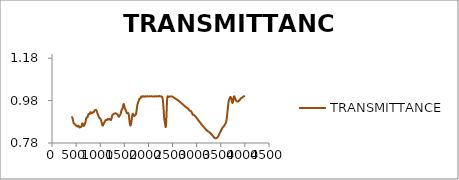
| Category | TRANSMITTANCE |
|---|---|
| 3999.640137 | 1.002 |
| 3997.71167 | 1.002 |
| 3995.783203 | 1.002 |
| 3993.854736 | 1.002 |
| 3991.92627 | 1.001 |
| 3989.997803 | 1.001 |
| 3988.069336 | 1.001 |
| 3986.140869 | 1.001 |
| 3984.212402 | 1.001 |
| 3982.283936 | 1 |
| 3980.355469 | 1 |
| 3978.427002 | 1 |
| 3976.498535 | 1 |
| 3974.570068 | 1 |
| 3972.641602 | 1 |
| 3970.713135 | 0.999 |
| 3968.784668 | 0.999 |
| 3966.856201 | 0.999 |
| 3964.927734 | 0.999 |
| 3962.999268 | 0.998 |
| 3961.070801 | 0.998 |
| 3959.142334 | 0.998 |
| 3957.213867 | 0.997 |
| 3955.2854 | 0.997 |
| 3953.356934 | 0.996 |
| 3951.428467 | 0.996 |
| 3949.5 | 0.996 |
| 3947.571533 | 0.995 |
| 3945.643066 | 0.995 |
| 3943.7146 | 0.994 |
| 3941.786133 | 0.994 |
| 3939.857666 | 0.994 |
| 3937.929199 | 0.993 |
| 3936.000732 | 0.993 |
| 3934.072266 | 0.993 |
| 3932.143799 | 0.993 |
| 3930.215332 | 0.993 |
| 3928.286865 | 0.992 |
| 3926.358398 | 0.992 |
| 3924.429932 | 0.992 |
| 3922.501465 | 0.992 |
| 3920.572998 | 0.992 |
| 3918.644531 | 0.991 |
| 3916.716064 | 0.991 |
| 3914.787598 | 0.99 |
| 3912.859131 | 0.989 |
| 3910.930664 | 0.989 |
| 3909.002197 | 0.988 |
| 3907.07373 | 0.987 |
| 3905.145264 | 0.986 |
| 3903.216797 | 0.986 |
| 3901.28833 | 0.985 |
| 3899.359863 | 0.985 |
| 3897.431396 | 0.984 |
| 3895.50293 | 0.984 |
| 3893.574463 | 0.983 |
| 3891.645996 | 0.983 |
| 3889.717529 | 0.983 |
| 3887.789063 | 0.983 |
| 3885.860596 | 0.982 |
| 3883.932129 | 0.982 |
| 3882.003662 | 0.982 |
| 3880.075195 | 0.981 |
| 3878.146729 | 0.98 |
| 3876.218262 | 0.98 |
| 3874.289795 | 0.979 |
| 3872.361328 | 0.979 |
| 3870.432861 | 0.978 |
| 3868.504395 | 0.977 |
| 3866.575928 | 0.977 |
| 3864.647461 | 0.977 |
| 3862.718994 | 0.976 |
| 3860.790527 | 0.976 |
| 3858.862061 | 0.976 |
| 3856.933594 | 0.976 |
| 3855.005127 | 0.976 |
| 3853.07666 | 0.976 |
| 3851.148193 | 0.976 |
| 3849.219727 | 0.976 |
| 3847.29126 | 0.976 |
| 3845.362793 | 0.976 |
| 3843.434326 | 0.976 |
| 3841.505859 | 0.976 |
| 3839.577393 | 0.976 |
| 3837.648926 | 0.976 |
| 3835.720459 | 0.976 |
| 3833.791992 | 0.977 |
| 3831.863525 | 0.977 |
| 3829.935059 | 0.977 |
| 3828.006592 | 0.977 |
| 3826.078125 | 0.978 |
| 3824.149658 | 0.979 |
| 3822.221191 | 0.979 |
| 3820.292725 | 0.98 |
| 3818.364258 | 0.98 |
| 3816.435791 | 0.981 |
| 3814.507324 | 0.981 |
| 3812.578857 | 0.982 |
| 3810.650391 | 0.982 |
| 3808.721924 | 0.983 |
| 3806.793457 | 0.984 |
| 3804.86499 | 0.985 |
| 3802.936523 | 0.986 |
| 3801.008057 | 0.987 |
| 3799.07959 | 0.989 |
| 3797.151123 | 0.99 |
| 3795.222656 | 0.991 |
| 3793.294189 | 0.993 |
| 3791.365723 | 0.994 |
| 3789.437256 | 0.996 |
| 3787.508789 | 0.997 |
| 3785.580322 | 0.998 |
| 3783.651855 | 0.999 |
| 3781.723389 | 1 |
| 3779.794922 | 1 |
| 3777.866455 | 1 |
| 3775.937988 | 1 |
| 3774.009521 | 0.999 |
| 3772.081055 | 0.998 |
| 3770.152588 | 0.997 |
| 3768.224121 | 0.996 |
| 3766.295654 | 0.994 |
| 3764.367188 | 0.991 |
| 3762.438721 | 0.989 |
| 3760.510254 | 0.986 |
| 3758.581787 | 0.983 |
| 3756.65332 | 0.981 |
| 3754.724854 | 0.978 |
| 3752.796387 | 0.976 |
| 3750.86792 | 0.974 |
| 3748.939453 | 0.972 |
| 3747.010986 | 0.97 |
| 3745.08252 | 0.969 |
| 3743.154053 | 0.969 |
| 3741.225586 | 0.969 |
| 3739.297119 | 0.969 |
| 3737.368652 | 0.97 |
| 3735.440186 | 0.972 |
| 3733.511719 | 0.973 |
| 3731.583252 | 0.975 |
| 3729.654785 | 0.977 |
| 3727.726318 | 0.979 |
| 3725.797852 | 0.982 |
| 3723.869385 | 0.984 |
| 3721.940918 | 0.986 |
| 3720.012451 | 0.988 |
| 3718.083984 | 0.989 |
| 3716.155518 | 0.991 |
| 3714.227051 | 0.992 |
| 3712.298584 | 0.994 |
| 3710.370117 | 0.995 |
| 3708.44165 | 0.996 |
| 3706.513184 | 0.997 |
| 3704.584717 | 0.997 |
| 3702.65625 | 0.997 |
| 3700.727783 | 0.998 |
| 3698.799316 | 0.997 |
| 3696.87085 | 0.997 |
| 3694.942383 | 0.997 |
| 3693.013916 | 0.996 |
| 3691.085449 | 0.995 |
| 3689.156982 | 0.994 |
| 3687.228516 | 0.993 |
| 3685.300049 | 0.991 |
| 3683.371582 | 0.99 |
| 3681.443115 | 0.989 |
| 3679.514648 | 0.988 |
| 3677.586182 | 0.987 |
| 3675.657715 | 0.986 |
| 3673.729248 | 0.985 |
| 3671.800781 | 0.984 |
| 3669.872314 | 0.982 |
| 3667.943848 | 0.981 |
| 3666.015381 | 0.979 |
| 3664.086914 | 0.977 |
| 3662.158447 | 0.975 |
| 3660.22998 | 0.972 |
| 3658.301514 | 0.969 |
| 3656.373047 | 0.966 |
| 3654.44458 | 0.962 |
| 3652.516113 | 0.958 |
| 3650.587646 | 0.954 |
| 3648.65918 | 0.95 |
| 3646.730713 | 0.946 |
| 3644.802246 | 0.941 |
| 3642.873779 | 0.937 |
| 3640.945313 | 0.933 |
| 3639.016846 | 0.929 |
| 3637.088379 | 0.925 |
| 3635.159912 | 0.92 |
| 3633.231445 | 0.916 |
| 3631.302979 | 0.912 |
| 3629.374512 | 0.908 |
| 3627.446045 | 0.904 |
| 3625.517578 | 0.901 |
| 3623.589111 | 0.897 |
| 3621.660645 | 0.894 |
| 3619.732178 | 0.89 |
| 3617.803711 | 0.888 |
| 3615.875244 | 0.885 |
| 3613.946777 | 0.883 |
| 3612.018311 | 0.881 |
| 3610.089844 | 0.879 |
| 3608.161377 | 0.878 |
| 3606.23291 | 0.876 |
| 3604.304443 | 0.875 |
| 3602.375977 | 0.874 |
| 3600.44751 | 0.873 |
| 3598.519043 | 0.872 |
| 3596.590576 | 0.872 |
| 3594.662109 | 0.871 |
| 3592.733643 | 0.87 |
| 3590.805176 | 0.869 |
| 3588.876709 | 0.869 |
| 3586.948242 | 0.868 |
| 3585.019775 | 0.867 |
| 3583.091309 | 0.867 |
| 3581.162842 | 0.866 |
| 3579.234375 | 0.865 |
| 3577.305908 | 0.864 |
| 3575.377441 | 0.864 |
| 3573.448975 | 0.863 |
| 3571.520508 | 0.862 |
| 3569.592041 | 0.861 |
| 3567.663574 | 0.86 |
| 3565.735107 | 0.86 |
| 3563.806641 | 0.859 |
| 3561.878174 | 0.858 |
| 3559.949707 | 0.858 |
| 3558.02124 | 0.857 |
| 3556.092773 | 0.857 |
| 3554.164307 | 0.857 |
| 3552.23584 | 0.856 |
| 3550.307373 | 0.856 |
| 3548.378906 | 0.856 |
| 3546.450439 | 0.855 |
| 3544.521973 | 0.855 |
| 3542.593506 | 0.854 |
| 3540.665039 | 0.854 |
| 3538.736572 | 0.853 |
| 3536.808105 | 0.853 |
| 3534.879639 | 0.852 |
| 3532.951172 | 0.851 |
| 3531.022705 | 0.85 |
| 3529.094238 | 0.85 |
| 3527.165771 | 0.849 |
| 3525.237305 | 0.848 |
| 3523.308838 | 0.847 |
| 3521.380371 | 0.846 |
| 3519.451904 | 0.845 |
| 3517.523438 | 0.845 |
| 3515.594971 | 0.844 |
| 3513.666504 | 0.843 |
| 3511.738037 | 0.842 |
| 3509.80957 | 0.841 |
| 3507.881104 | 0.84 |
| 3505.952637 | 0.839 |
| 3504.02417 | 0.839 |
| 3502.095703 | 0.838 |
| 3500.167236 | 0.837 |
| 3498.23877 | 0.836 |
| 3496.310303 | 0.835 |
| 3494.381836 | 0.834 |
| 3492.453369 | 0.833 |
| 3490.524902 | 0.832 |
| 3488.596436 | 0.832 |
| 3486.667969 | 0.831 |
| 3484.739502 | 0.83 |
| 3482.811035 | 0.829 |
| 3480.882568 | 0.828 |
| 3478.954102 | 0.827 |
| 3477.025635 | 0.826 |
| 3475.097168 | 0.826 |
| 3473.168701 | 0.825 |
| 3471.240234 | 0.824 |
| 3469.311768 | 0.823 |
| 3467.383301 | 0.822 |
| 3465.454834 | 0.821 |
| 3463.526367 | 0.82 |
| 3461.5979 | 0.819 |
| 3459.669434 | 0.818 |
| 3457.740967 | 0.817 |
| 3455.8125 | 0.816 |
| 3453.884033 | 0.815 |
| 3451.955566 | 0.814 |
| 3450.0271 | 0.813 |
| 3448.098633 | 0.812 |
| 3446.170166 | 0.812 |
| 3444.241699 | 0.811 |
| 3442.313232 | 0.81 |
| 3440.384766 | 0.81 |
| 3438.456299 | 0.809 |
| 3436.527832 | 0.809 |
| 3434.599365 | 0.808 |
| 3432.670898 | 0.808 |
| 3430.742432 | 0.807 |
| 3428.813965 | 0.807 |
| 3426.885498 | 0.806 |
| 3424.957031 | 0.806 |
| 3423.028564 | 0.805 |
| 3421.100098 | 0.805 |
| 3419.171631 | 0.804 |
| 3417.243164 | 0.804 |
| 3415.314697 | 0.804 |
| 3413.38623 | 0.803 |
| 3411.457764 | 0.803 |
| 3409.529297 | 0.803 |
| 3407.60083 | 0.803 |
| 3405.672363 | 0.803 |
| 3403.743896 | 0.803 |
| 3401.81543 | 0.802 |
| 3399.886963 | 0.802 |
| 3397.958496 | 0.802 |
| 3396.030029 | 0.802 |
| 3394.101563 | 0.802 |
| 3392.173096 | 0.802 |
| 3390.244629 | 0.802 |
| 3388.316162 | 0.802 |
| 3386.387695 | 0.803 |
| 3384.459229 | 0.803 |
| 3382.530762 | 0.803 |
| 3380.602295 | 0.803 |
| 3378.673828 | 0.803 |
| 3376.745361 | 0.803 |
| 3374.816895 | 0.804 |
| 3372.888428 | 0.804 |
| 3370.959961 | 0.804 |
| 3369.031494 | 0.804 |
| 3367.103027 | 0.805 |
| 3365.174561 | 0.805 |
| 3363.246094 | 0.806 |
| 3361.317627 | 0.806 |
| 3359.38916 | 0.807 |
| 3357.460693 | 0.807 |
| 3355.532227 | 0.808 |
| 3353.60376 | 0.808 |
| 3351.675293 | 0.809 |
| 3349.746826 | 0.809 |
| 3347.818359 | 0.81 |
| 3345.889893 | 0.81 |
| 3343.961426 | 0.811 |
| 3342.032959 | 0.811 |
| 3340.104492 | 0.812 |
| 3338.176025 | 0.812 |
| 3336.247559 | 0.813 |
| 3334.319092 | 0.813 |
| 3332.390625 | 0.814 |
| 3330.462158 | 0.815 |
| 3328.533691 | 0.815 |
| 3326.605225 | 0.816 |
| 3324.676758 | 0.816 |
| 3322.748291 | 0.817 |
| 3320.819824 | 0.818 |
| 3318.891357 | 0.818 |
| 3316.962891 | 0.819 |
| 3315.034424 | 0.819 |
| 3313.105957 | 0.82 |
| 3311.17749 | 0.82 |
| 3309.249023 | 0.821 |
| 3307.320557 | 0.822 |
| 3305.39209 | 0.822 |
| 3303.463623 | 0.823 |
| 3301.535156 | 0.823 |
| 3299.606689 | 0.824 |
| 3297.678223 | 0.824 |
| 3295.749756 | 0.825 |
| 3293.821289 | 0.825 |
| 3291.892822 | 0.825 |
| 3289.964355 | 0.826 |
| 3288.035889 | 0.826 |
| 3286.107422 | 0.827 |
| 3284.178955 | 0.827 |
| 3282.250488 | 0.828 |
| 3280.322021 | 0.828 |
| 3278.393555 | 0.828 |
| 3276.465088 | 0.829 |
| 3274.536621 | 0.829 |
| 3272.608154 | 0.829 |
| 3270.679688 | 0.83 |
| 3268.751221 | 0.83 |
| 3266.822754 | 0.831 |
| 3264.894287 | 0.831 |
| 3262.96582 | 0.831 |
| 3261.037354 | 0.831 |
| 3259.108887 | 0.832 |
| 3257.18042 | 0.832 |
| 3255.251953 | 0.832 |
| 3253.323486 | 0.833 |
| 3251.39502 | 0.833 |
| 3249.466553 | 0.833 |
| 3247.538086 | 0.833 |
| 3245.609619 | 0.834 |
| 3243.681152 | 0.834 |
| 3241.752686 | 0.834 |
| 3239.824219 | 0.835 |
| 3237.895752 | 0.835 |
| 3235.967285 | 0.835 |
| 3234.038818 | 0.836 |
| 3232.110352 | 0.836 |
| 3230.181885 | 0.836 |
| 3228.253418 | 0.836 |
| 3226.324951 | 0.837 |
| 3224.396484 | 0.837 |
| 3222.468018 | 0.837 |
| 3220.539551 | 0.837 |
| 3218.611084 | 0.838 |
| 3216.682617 | 0.838 |
| 3214.75415 | 0.838 |
| 3212.825684 | 0.839 |
| 3210.897217 | 0.839 |
| 3208.96875 | 0.84 |
| 3207.040283 | 0.84 |
| 3205.111816 | 0.84 |
| 3203.18335 | 0.841 |
| 3201.254883 | 0.841 |
| 3199.326416 | 0.842 |
| 3197.397949 | 0.842 |
| 3195.469482 | 0.843 |
| 3193.541016 | 0.843 |
| 3191.612549 | 0.844 |
| 3189.684082 | 0.844 |
| 3187.755615 | 0.845 |
| 3185.827148 | 0.845 |
| 3183.898682 | 0.846 |
| 3181.970215 | 0.846 |
| 3180.041748 | 0.847 |
| 3178.113281 | 0.847 |
| 3176.184814 | 0.848 |
| 3174.256348 | 0.848 |
| 3172.327881 | 0.849 |
| 3170.399414 | 0.849 |
| 3168.470947 | 0.85 |
| 3166.54248 | 0.85 |
| 3164.614014 | 0.851 |
| 3162.685547 | 0.851 |
| 3160.75708 | 0.852 |
| 3158.828613 | 0.853 |
| 3156.900146 | 0.853 |
| 3154.97168 | 0.854 |
| 3153.043213 | 0.854 |
| 3151.114746 | 0.855 |
| 3149.186279 | 0.855 |
| 3147.257813 | 0.856 |
| 3145.329346 | 0.856 |
| 3143.400879 | 0.857 |
| 3141.472412 | 0.857 |
| 3139.543945 | 0.857 |
| 3137.615479 | 0.858 |
| 3135.687012 | 0.858 |
| 3133.758545 | 0.859 |
| 3131.830078 | 0.859 |
| 3129.901611 | 0.86 |
| 3127.973145 | 0.86 |
| 3126.044678 | 0.86 |
| 3124.116211 | 0.861 |
| 3122.187744 | 0.861 |
| 3120.259277 | 0.862 |
| 3118.330811 | 0.863 |
| 3116.402344 | 0.863 |
| 3114.473877 | 0.864 |
| 3112.54541 | 0.864 |
| 3110.616943 | 0.865 |
| 3108.688477 | 0.865 |
| 3106.76001 | 0.866 |
| 3104.831543 | 0.866 |
| 3102.903076 | 0.867 |
| 3100.974609 | 0.868 |
| 3099.046143 | 0.868 |
| 3097.117676 | 0.869 |
| 3095.189209 | 0.869 |
| 3093.260742 | 0.87 |
| 3091.332275 | 0.87 |
| 3089.403809 | 0.871 |
| 3087.475342 | 0.871 |
| 3085.546875 | 0.872 |
| 3083.618408 | 0.873 |
| 3081.689941 | 0.873 |
| 3079.761475 | 0.874 |
| 3077.833008 | 0.874 |
| 3075.904541 | 0.875 |
| 3073.976074 | 0.876 |
| 3072.047607 | 0.876 |
| 3070.119141 | 0.877 |
| 3068.190674 | 0.877 |
| 3066.262207 | 0.878 |
| 3064.33374 | 0.878 |
| 3062.405273 | 0.879 |
| 3060.476807 | 0.88 |
| 3058.54834 | 0.88 |
| 3056.619873 | 0.881 |
| 3054.691406 | 0.881 |
| 3052.762939 | 0.882 |
| 3050.834473 | 0.882 |
| 3048.906006 | 0.883 |
| 3046.977539 | 0.884 |
| 3045.049072 | 0.884 |
| 3043.120605 | 0.885 |
| 3041.192139 | 0.885 |
| 3039.263672 | 0.886 |
| 3037.335205 | 0.886 |
| 3035.406738 | 0.887 |
| 3033.478271 | 0.888 |
| 3031.549805 | 0.888 |
| 3029.621338 | 0.889 |
| 3027.692871 | 0.889 |
| 3025.764404 | 0.89 |
| 3023.835938 | 0.891 |
| 3021.907471 | 0.891 |
| 3019.979004 | 0.892 |
| 3018.050537 | 0.893 |
| 3016.12207 | 0.893 |
| 3014.193604 | 0.894 |
| 3012.265137 | 0.894 |
| 3010.33667 | 0.895 |
| 3008.408203 | 0.895 |
| 3006.479736 | 0.896 |
| 3004.55127 | 0.897 |
| 3002.622803 | 0.897 |
| 3000.694336 | 0.898 |
| 2998.765869 | 0.898 |
| 2996.837402 | 0.899 |
| 2994.908936 | 0.9 |
| 2992.980469 | 0.9 |
| 2991.052002 | 0.901 |
| 2989.123535 | 0.901 |
| 2987.195068 | 0.902 |
| 2985.266602 | 0.903 |
| 2983.338135 | 0.903 |
| 2981.409668 | 0.904 |
| 2979.481201 | 0.904 |
| 2977.552734 | 0.905 |
| 2975.624268 | 0.905 |
| 2973.695801 | 0.906 |
| 2971.767334 | 0.906 |
| 2969.838867 | 0.907 |
| 2967.9104 | 0.907 |
| 2965.981934 | 0.907 |
| 2964.053467 | 0.908 |
| 2962.125 | 0.908 |
| 2960.196533 | 0.909 |
| 2958.268066 | 0.909 |
| 2956.3396 | 0.91 |
| 2954.411133 | 0.91 |
| 2952.482666 | 0.911 |
| 2950.554199 | 0.911 |
| 2948.625732 | 0.912 |
| 2946.697266 | 0.912 |
| 2944.768799 | 0.912 |
| 2942.840332 | 0.913 |
| 2940.911865 | 0.913 |
| 2938.983398 | 0.913 |
| 2937.054932 | 0.913 |
| 2935.126465 | 0.913 |
| 2933.197998 | 0.913 |
| 2931.269531 | 0.913 |
| 2929.341064 | 0.913 |
| 2927.412598 | 0.913 |
| 2925.484131 | 0.913 |
| 2923.555664 | 0.913 |
| 2921.627197 | 0.913 |
| 2919.69873 | 0.913 |
| 2917.770264 | 0.914 |
| 2915.841797 | 0.915 |
| 2913.91333 | 0.915 |
| 2911.984863 | 0.916 |
| 2910.056396 | 0.917 |
| 2908.12793 | 0.918 |
| 2906.199463 | 0.92 |
| 2904.270996 | 0.921 |
| 2902.342529 | 0.922 |
| 2900.414063 | 0.923 |
| 2898.485596 | 0.924 |
| 2896.557129 | 0.925 |
| 2894.628662 | 0.926 |
| 2892.700195 | 0.927 |
| 2890.771729 | 0.927 |
| 2888.843262 | 0.928 |
| 2886.914795 | 0.929 |
| 2884.986328 | 0.929 |
| 2883.057861 | 0.93 |
| 2881.129395 | 0.93 |
| 2879.200928 | 0.931 |
| 2877.272461 | 0.931 |
| 2875.343994 | 0.931 |
| 2873.415527 | 0.931 |
| 2871.487061 | 0.932 |
| 2869.558594 | 0.932 |
| 2867.630127 | 0.932 |
| 2865.70166 | 0.932 |
| 2863.773193 | 0.932 |
| 2861.844727 | 0.932 |
| 2859.91626 | 0.932 |
| 2857.987793 | 0.933 |
| 2856.059326 | 0.933 |
| 2854.130859 | 0.933 |
| 2852.202393 | 0.933 |
| 2850.273926 | 0.934 |
| 2848.345459 | 0.934 |
| 2846.416992 | 0.935 |
| 2844.488525 | 0.935 |
| 2842.560059 | 0.936 |
| 2840.631592 | 0.937 |
| 2838.703125 | 0.937 |
| 2836.774658 | 0.938 |
| 2834.846191 | 0.939 |
| 2832.917725 | 0.939 |
| 2830.989258 | 0.94 |
| 2829.060791 | 0.94 |
| 2827.132324 | 0.941 |
| 2825.203857 | 0.941 |
| 2823.275391 | 0.942 |
| 2821.346924 | 0.942 |
| 2819.418457 | 0.943 |
| 2817.48999 | 0.943 |
| 2815.561523 | 0.943 |
| 2813.633057 | 0.944 |
| 2811.70459 | 0.944 |
| 2809.776123 | 0.944 |
| 2807.847656 | 0.945 |
| 2805.919189 | 0.945 |
| 2803.990723 | 0.945 |
| 2802.062256 | 0.945 |
| 2800.133789 | 0.946 |
| 2798.205322 | 0.946 |
| 2796.276855 | 0.946 |
| 2794.348389 | 0.946 |
| 2792.419922 | 0.947 |
| 2790.491455 | 0.947 |
| 2788.562988 | 0.947 |
| 2786.634521 | 0.947 |
| 2784.706055 | 0.948 |
| 2782.777588 | 0.948 |
| 2780.849121 | 0.948 |
| 2778.920654 | 0.949 |
| 2776.992188 | 0.949 |
| 2775.063721 | 0.949 |
| 2773.135254 | 0.95 |
| 2771.206787 | 0.95 |
| 2769.27832 | 0.951 |
| 2767.349854 | 0.951 |
| 2765.421387 | 0.951 |
| 2763.49292 | 0.952 |
| 2761.564453 | 0.952 |
| 2759.635986 | 0.952 |
| 2757.70752 | 0.953 |
| 2755.779053 | 0.953 |
| 2753.850586 | 0.953 |
| 2751.922119 | 0.954 |
| 2749.993652 | 0.954 |
| 2748.065186 | 0.954 |
| 2746.136719 | 0.955 |
| 2744.208252 | 0.955 |
| 2742.279785 | 0.956 |
| 2740.351318 | 0.956 |
| 2738.422852 | 0.956 |
| 2736.494385 | 0.957 |
| 2734.565918 | 0.957 |
| 2732.637451 | 0.958 |
| 2730.708984 | 0.958 |
| 2728.780518 | 0.959 |
| 2726.852051 | 0.959 |
| 2724.923584 | 0.959 |
| 2722.995117 | 0.96 |
| 2721.06665 | 0.96 |
| 2719.138184 | 0.961 |
| 2717.209717 | 0.961 |
| 2715.28125 | 0.962 |
| 2713.352783 | 0.962 |
| 2711.424316 | 0.962 |
| 2709.49585 | 0.963 |
| 2707.567383 | 0.963 |
| 2705.638916 | 0.964 |
| 2703.710449 | 0.964 |
| 2701.781982 | 0.964 |
| 2699.853516 | 0.965 |
| 2697.925049 | 0.965 |
| 2695.996582 | 0.966 |
| 2694.068115 | 0.966 |
| 2692.139648 | 0.966 |
| 2690.211182 | 0.967 |
| 2688.282715 | 0.967 |
| 2686.354248 | 0.968 |
| 2684.425781 | 0.968 |
| 2682.497314 | 0.969 |
| 2680.568848 | 0.969 |
| 2678.640381 | 0.969 |
| 2676.711914 | 0.97 |
| 2674.783447 | 0.97 |
| 2672.85498 | 0.971 |
| 2670.926514 | 0.971 |
| 2668.998047 | 0.971 |
| 2667.06958 | 0.972 |
| 2665.141113 | 0.972 |
| 2663.212646 | 0.972 |
| 2661.28418 | 0.973 |
| 2659.355713 | 0.973 |
| 2657.427246 | 0.973 |
| 2655.498779 | 0.974 |
| 2653.570313 | 0.974 |
| 2651.641846 | 0.974 |
| 2649.713379 | 0.975 |
| 2647.784912 | 0.975 |
| 2645.856445 | 0.975 |
| 2643.927979 | 0.976 |
| 2641.999512 | 0.976 |
| 2640.071045 | 0.976 |
| 2638.142578 | 0.977 |
| 2636.214111 | 0.977 |
| 2634.285645 | 0.978 |
| 2632.357178 | 0.978 |
| 2630.428711 | 0.978 |
| 2628.500244 | 0.979 |
| 2626.571777 | 0.979 |
| 2624.643311 | 0.979 |
| 2622.714844 | 0.98 |
| 2620.786377 | 0.98 |
| 2618.85791 | 0.98 |
| 2616.929443 | 0.981 |
| 2615.000977 | 0.981 |
| 2613.07251 | 0.981 |
| 2611.144043 | 0.981 |
| 2609.215576 | 0.982 |
| 2607.287109 | 0.982 |
| 2605.358643 | 0.982 |
| 2603.430176 | 0.983 |
| 2601.501709 | 0.983 |
| 2599.573242 | 0.983 |
| 2597.644775 | 0.984 |
| 2595.716309 | 0.984 |
| 2593.787842 | 0.984 |
| 2591.859375 | 0.985 |
| 2589.930908 | 0.985 |
| 2588.002441 | 0.985 |
| 2586.073975 | 0.986 |
| 2584.145508 | 0.986 |
| 2582.217041 | 0.986 |
| 2580.288574 | 0.987 |
| 2578.360107 | 0.987 |
| 2576.431641 | 0.987 |
| 2574.503174 | 0.988 |
| 2572.574707 | 0.988 |
| 2570.64624 | 0.988 |
| 2568.717773 | 0.988 |
| 2566.789307 | 0.989 |
| 2564.86084 | 0.989 |
| 2562.932373 | 0.989 |
| 2561.003906 | 0.989 |
| 2559.075439 | 0.99 |
| 2557.146973 | 0.99 |
| 2555.218506 | 0.99 |
| 2553.290039 | 0.991 |
| 2551.361572 | 0.991 |
| 2549.433105 | 0.991 |
| 2547.504639 | 0.992 |
| 2545.576172 | 0.992 |
| 2543.647705 | 0.992 |
| 2541.719238 | 0.992 |
| 2539.790771 | 0.993 |
| 2537.862305 | 0.993 |
| 2535.933838 | 0.993 |
| 2534.005371 | 0.994 |
| 2532.076904 | 0.994 |
| 2530.148438 | 0.994 |
| 2528.219971 | 0.994 |
| 2526.291504 | 0.995 |
| 2524.363037 | 0.995 |
| 2522.43457 | 0.995 |
| 2520.506104 | 0.995 |
| 2518.577637 | 0.996 |
| 2516.64917 | 0.996 |
| 2514.720703 | 0.996 |
| 2512.792236 | 0.997 |
| 2510.86377 | 0.997 |
| 2508.935303 | 0.997 |
| 2507.006836 | 0.997 |
| 2505.078369 | 0.998 |
| 2503.149902 | 0.998 |
| 2501.221436 | 0.998 |
| 2499.292969 | 0.999 |
| 2497.364502 | 0.999 |
| 2495.436035 | 0.999 |
| 2493.507568 | 1 |
| 2491.579102 | 1 |
| 2489.650635 | 1 |
| 2487.722168 | 1 |
| 2485.793701 | 1 |
| 2483.865234 | 1 |
| 2481.936768 | 1 |
| 2480.008301 | 1 |
| 2478.079834 | 1 |
| 2476.151367 | 1 |
| 2474.2229 | 1 |
| 2472.294434 | 1 |
| 2470.365967 | 1 |
| 2468.4375 | 1 |
| 2466.509033 | 1 |
| 2464.580566 | 1 |
| 2462.6521 | 1 |
| 2460.723633 | 1 |
| 2458.795166 | 1 |
| 2456.866699 | 1 |
| 2454.938232 | 1 |
| 2453.009766 | 1 |
| 2451.081299 | 1 |
| 2449.152832 | 1 |
| 2447.224365 | 1 |
| 2445.295898 | 1 |
| 2443.367432 | 1 |
| 2441.438965 | 1 |
| 2439.510498 | 1 |
| 2437.582031 | 1 |
| 2435.653564 | 1 |
| 2433.725098 | 1 |
| 2431.796631 | 0.999 |
| 2429.868164 | 0.999 |
| 2427.939697 | 0.999 |
| 2426.01123 | 0.998 |
| 2424.082764 | 0.998 |
| 2422.154297 | 0.998 |
| 2420.22583 | 0.998 |
| 2418.297363 | 0.997 |
| 2416.368896 | 0.997 |
| 2414.44043 | 0.997 |
| 2412.511963 | 0.998 |
| 2410.583496 | 0.998 |
| 2408.655029 | 0.998 |
| 2406.726563 | 0.999 |
| 2404.798096 | 0.999 |
| 2402.869629 | 1 |
| 2400.941162 | 1 |
| 2399.012695 | 1 |
| 2397.084229 | 1 |
| 2395.155762 | 0.999 |
| 2393.227295 | 0.997 |
| 2391.298828 | 0.994 |
| 2389.370361 | 0.99 |
| 2387.441895 | 0.984 |
| 2385.513428 | 0.977 |
| 2383.584961 | 0.968 |
| 2381.656494 | 0.958 |
| 2379.728027 | 0.947 |
| 2377.799561 | 0.935 |
| 2375.871094 | 0.923 |
| 2373.942627 | 0.911 |
| 2372.01416 | 0.899 |
| 2370.085693 | 0.888 |
| 2368.157227 | 0.878 |
| 2366.22876 | 0.87 |
| 2364.300293 | 0.864 |
| 2362.371826 | 0.859 |
| 2360.443359 | 0.856 |
| 2358.514893 | 0.855 |
| 2356.586426 | 0.855 |
| 2354.657959 | 0.857 |
| 2352.729492 | 0.859 |
| 2350.801025 | 0.862 |
| 2348.872559 | 0.865 |
| 2346.944092 | 0.868 |
| 2345.015625 | 0.871 |
| 2343.087158 | 0.874 |
| 2341.158691 | 0.877 |
| 2339.230225 | 0.879 |
| 2337.301758 | 0.881 |
| 2335.373291 | 0.883 |
| 2333.444824 | 0.886 |
| 2331.516357 | 0.888 |
| 2329.587891 | 0.892 |
| 2327.659424 | 0.896 |
| 2325.730957 | 0.9 |
| 2323.80249 | 0.906 |
| 2321.874023 | 0.911 |
| 2319.945557 | 0.918 |
| 2318.01709 | 0.924 |
| 2316.088623 | 0.931 |
| 2314.160156 | 0.938 |
| 2312.231689 | 0.945 |
| 2310.303223 | 0.951 |
| 2308.374756 | 0.958 |
| 2306.446289 | 0.963 |
| 2304.517822 | 0.969 |
| 2302.589355 | 0.974 |
| 2300.660889 | 0.978 |
| 2298.732422 | 0.982 |
| 2296.803955 | 0.985 |
| 2294.875488 | 0.988 |
| 2292.947021 | 0.991 |
| 2291.018555 | 0.993 |
| 2289.090088 | 0.994 |
| 2287.161621 | 0.996 |
| 2285.233154 | 0.997 |
| 2283.304688 | 0.998 |
| 2281.376221 | 0.998 |
| 2279.447754 | 0.999 |
| 2277.519287 | 0.999 |
| 2275.59082 | 1 |
| 2273.662354 | 1 |
| 2271.733887 | 1 |
| 2269.80542 | 1 |
| 2267.876953 | 1 |
| 2265.948486 | 1 |
| 2264.02002 | 1 |
| 2262.091553 | 1 |
| 2260.163086 | 1 |
| 2258.234619 | 1 |
| 2256.306152 | 1 |
| 2254.377686 | 1 |
| 2252.449219 | 1 |
| 2250.520752 | 1 |
| 2248.592285 | 1 |
| 2246.663818 | 1 |
| 2244.735352 | 1 |
| 2242.806885 | 1.001 |
| 2240.878418 | 1.001 |
| 2238.949951 | 1.001 |
| 2237.021484 | 1.001 |
| 2235.093018 | 1.001 |
| 2233.164551 | 1.001 |
| 2231.236084 | 1.001 |
| 2229.307617 | 1.001 |
| 2227.37915 | 1.001 |
| 2225.450684 | 1.001 |
| 2223.522217 | 1.001 |
| 2221.59375 | 1.001 |
| 2219.665283 | 1.001 |
| 2217.736816 | 1.001 |
| 2215.80835 | 1 |
| 2213.879883 | 1 |
| 2211.951416 | 1 |
| 2210.022949 | 1 |
| 2208.094482 | 1 |
| 2206.166016 | 1 |
| 2204.237549 | 1 |
| 2202.309082 | 1 |
| 2200.380615 | 1 |
| 2198.452148 | 1 |
| 2196.523682 | 1 |
| 2194.595215 | 1 |
| 2192.666748 | 1 |
| 2190.738281 | 1.001 |
| 2188.809814 | 1.001 |
| 2186.881348 | 1.001 |
| 2184.952881 | 1.001 |
| 2183.024414 | 1.001 |
| 2181.095947 | 1.001 |
| 2179.16748 | 1.001 |
| 2177.239014 | 1.001 |
| 2175.310547 | 1 |
| 2173.38208 | 1 |
| 2171.453613 | 1 |
| 2169.525146 | 1 |
| 2167.59668 | 1 |
| 2165.668213 | 1 |
| 2163.739746 | 1 |
| 2161.811279 | 1 |
| 2159.882813 | 1 |
| 2157.954346 | 1 |
| 2156.025879 | 1 |
| 2154.097412 | 1 |
| 2152.168945 | 1 |
| 2150.240479 | 1 |
| 2148.312012 | 1 |
| 2146.383545 | 1 |
| 2144.455078 | 1 |
| 2142.526611 | 1 |
| 2140.598145 | 1 |
| 2138.669678 | 1 |
| 2136.741211 | 1 |
| 2134.812744 | 1 |
| 2132.884277 | 1 |
| 2130.955811 | 1 |
| 2129.027344 | 1 |
| 2127.098877 | 1 |
| 2125.17041 | 1 |
| 2123.241943 | 1 |
| 2121.313477 | 1 |
| 2119.38501 | 1 |
| 2117.456543 | 1 |
| 2115.528076 | 1 |
| 2113.599609 | 1 |
| 2111.671143 | 1 |
| 2109.742676 | 1 |
| 2107.814209 | 1 |
| 2105.885742 | 1 |
| 2103.957275 | 1 |
| 2102.028809 | 1 |
| 2100.100342 | 1 |
| 2098.171875 | 1 |
| 2096.243408 | 1 |
| 2094.314941 | 1 |
| 2092.386475 | 1 |
| 2090.458008 | 1 |
| 2088.529541 | 1 |
| 2086.601074 | 0.999 |
| 2084.672607 | 0.999 |
| 2082.744141 | 0.999 |
| 2080.815674 | 0.999 |
| 2078.887207 | 1 |
| 2076.95874 | 1 |
| 2075.030273 | 1 |
| 2073.101807 | 1 |
| 2071.17334 | 1 |
| 2069.244873 | 1 |
| 2067.316406 | 1 |
| 2065.387939 | 1 |
| 2063.459473 | 1 |
| 2061.531006 | 1 |
| 2059.602539 | 1 |
| 2057.674072 | 1 |
| 2055.745605 | 1 |
| 2053.817139 | 1 |
| 2051.888672 | 1 |
| 2049.960205 | 1 |
| 2048.031738 | 1 |
| 2046.103271 | 1 |
| 2044.174805 | 1 |
| 2042.246338 | 1 |
| 2040.317871 | 1 |
| 2038.389404 | 1 |
| 2036.460938 | 1 |
| 2034.532471 | 1 |
| 2032.604004 | 1 |
| 2030.675537 | 1 |
| 2028.74707 | 1 |
| 2026.818604 | 1 |
| 2024.890137 | 1.001 |
| 2022.96167 | 1.001 |
| 2021.033203 | 1.001 |
| 2019.104736 | 1.001 |
| 2017.17627 | 1 |
| 2015.247803 | 1 |
| 2013.319336 | 1 |
| 2011.390869 | 1 |
| 2009.462402 | 1 |
| 2007.533936 | 1 |
| 2005.605469 | 1 |
| 2003.677002 | 0.999 |
| 2001.748535 | 0.999 |
| 1999.820068 | 0.999 |
| 1997.891602 | 0.999 |
| 1995.963135 | 0.999 |
| 1994.034668 | 0.999 |
| 1992.106201 | 1 |
| 1990.177734 | 1 |
| 1988.249268 | 1 |
| 1986.320801 | 1 |
| 1984.392334 | 1 |
| 1982.463867 | 1.001 |
| 1980.5354 | 1.001 |
| 1978.606934 | 1.001 |
| 1976.678467 | 1.001 |
| 1974.75 | 1.001 |
| 1972.821533 | 1.001 |
| 1970.893066 | 1.001 |
| 1968.9646 | 1 |
| 1967.036133 | 1 |
| 1965.107666 | 1 |
| 1963.179199 | 1 |
| 1961.250732 | 1 |
| 1959.322266 | 1 |
| 1957.393799 | 1 |
| 1955.465332 | 1 |
| 1953.536865 | 1 |
| 1951.608398 | 1 |
| 1949.679932 | 1 |
| 1947.751465 | 1 |
| 1945.822998 | 1 |
| 1943.894531 | 1 |
| 1941.966064 | 1 |
| 1940.037598 | 1 |
| 1938.109131 | 1 |
| 1936.180664 | 1 |
| 1934.252197 | 1 |
| 1932.32373 | 1 |
| 1930.395264 | 1 |
| 1928.466797 | 0.999 |
| 1926.53833 | 0.999 |
| 1924.609863 | 0.999 |
| 1922.681396 | 0.998 |
| 1920.75293 | 0.998 |
| 1918.824463 | 0.998 |
| 1916.895996 | 0.998 |
| 1914.967529 | 0.998 |
| 1913.039063 | 0.998 |
| 1911.110596 | 0.998 |
| 1909.182129 | 0.999 |
| 1907.253662 | 0.999 |
| 1905.325195 | 0.999 |
| 1903.396729 | 1 |
| 1901.468262 | 1 |
| 1899.539795 | 1 |
| 1897.611328 | 1.001 |
| 1895.682861 | 1.001 |
| 1893.754395 | 1.001 |
| 1891.825928 | 1.001 |
| 1889.897461 | 1 |
| 1887.968994 | 1 |
| 1886.040527 | 1 |
| 1884.112061 | 1 |
| 1882.183594 | 0.999 |
| 1880.255127 | 0.999 |
| 1878.32666 | 0.999 |
| 1876.398193 | 0.999 |
| 1874.469727 | 0.999 |
| 1872.54126 | 0.999 |
| 1870.612793 | 0.999 |
| 1868.684326 | 0.999 |
| 1866.755859 | 0.999 |
| 1864.827393 | 0.999 |
| 1862.898926 | 1 |
| 1860.970459 | 1 |
| 1859.041992 | 1 |
| 1857.113525 | 1 |
| 1855.185059 | 1 |
| 1853.256592 | 1 |
| 1851.328125 | 0.999 |
| 1849.399658 | 0.999 |
| 1847.471191 | 0.998 |
| 1845.542725 | 0.997 |
| 1843.614258 | 0.996 |
| 1841.685791 | 0.994 |
| 1839.757324 | 0.993 |
| 1837.828857 | 0.992 |
| 1835.900391 | 0.991 |
| 1833.971924 | 0.991 |
| 1832.043457 | 0.99 |
| 1830.11499 | 0.99 |
| 1828.186523 | 0.99 |
| 1826.258057 | 0.989 |
| 1824.32959 | 0.989 |
| 1822.401123 | 0.989 |
| 1820.472656 | 0.989 |
| 1818.544189 | 0.989 |
| 1816.615723 | 0.989 |
| 1814.687256 | 0.988 |
| 1812.758789 | 0.988 |
| 1810.830322 | 0.987 |
| 1808.901855 | 0.986 |
| 1806.973389 | 0.985 |
| 1805.044922 | 0.984 |
| 1803.116455 | 0.982 |
| 1801.187988 | 0.981 |
| 1799.259521 | 0.98 |
| 1797.331055 | 0.979 |
| 1795.402588 | 0.977 |
| 1793.474121 | 0.976 |
| 1791.545654 | 0.975 |
| 1789.617188 | 0.974 |
| 1787.688721 | 0.973 |
| 1785.760254 | 0.972 |
| 1783.831787 | 0.971 |
| 1781.90332 | 0.97 |
| 1779.974854 | 0.968 |
| 1778.046387 | 0.967 |
| 1776.11792 | 0.965 |
| 1774.189453 | 0.964 |
| 1772.260986 | 0.962 |
| 1770.33252 | 0.959 |
| 1768.404053 | 0.957 |
| 1766.475586 | 0.954 |
| 1764.547119 | 0.952 |
| 1762.618652 | 0.948 |
| 1760.690186 | 0.945 |
| 1758.761719 | 0.942 |
| 1756.833252 | 0.939 |
| 1754.904785 | 0.935 |
| 1752.976318 | 0.932 |
| 1751.047852 | 0.929 |
| 1749.119385 | 0.926 |
| 1747.190918 | 0.923 |
| 1745.262451 | 0.92 |
| 1743.333984 | 0.918 |
| 1741.405518 | 0.917 |
| 1739.477051 | 0.915 |
| 1737.548584 | 0.914 |
| 1735.620117 | 0.914 |
| 1733.69165 | 0.913 |
| 1731.763184 | 0.913 |
| 1729.834717 | 0.913 |
| 1727.90625 | 0.912 |
| 1725.977783 | 0.912 |
| 1724.049316 | 0.912 |
| 1722.12085 | 0.911 |
| 1720.192383 | 0.911 |
| 1718.263916 | 0.91 |
| 1716.335449 | 0.91 |
| 1714.406982 | 0.909 |
| 1712.478516 | 0.908 |
| 1710.550049 | 0.907 |
| 1708.621582 | 0.907 |
| 1706.693115 | 0.907 |
| 1704.764648 | 0.907 |
| 1702.836182 | 0.907 |
| 1700.907715 | 0.908 |
| 1698.979248 | 0.908 |
| 1697.050781 | 0.909 |
| 1695.122314 | 0.91 |
| 1693.193848 | 0.911 |
| 1691.265381 | 0.912 |
| 1689.336914 | 0.913 |
| 1687.408447 | 0.914 |
| 1685.47998 | 0.915 |
| 1683.551514 | 0.916 |
| 1681.623047 | 0.917 |
| 1679.69458 | 0.917 |
| 1677.766113 | 0.918 |
| 1675.837646 | 0.918 |
| 1673.90918 | 0.917 |
| 1671.980713 | 0.917 |
| 1670.052246 | 0.916 |
| 1668.123779 | 0.914 |
| 1666.195313 | 0.913 |
| 1664.266846 | 0.91 |
| 1662.338379 | 0.908 |
| 1660.409912 | 0.905 |
| 1658.481445 | 0.901 |
| 1656.552979 | 0.898 |
| 1654.624512 | 0.895 |
| 1652.696045 | 0.891 |
| 1650.767578 | 0.888 |
| 1648.839111 | 0.884 |
| 1646.910645 | 0.881 |
| 1644.982178 | 0.878 |
| 1643.053711 | 0.875 |
| 1641.125244 | 0.872 |
| 1639.196777 | 0.87 |
| 1637.268311 | 0.868 |
| 1635.339844 | 0.867 |
| 1633.411377 | 0.865 |
| 1631.48291 | 0.864 |
| 1629.554443 | 0.863 |
| 1627.625977 | 0.862 |
| 1625.69751 | 0.862 |
| 1623.769043 | 0.863 |
| 1621.840576 | 0.863 |
| 1619.912109 | 0.865 |
| 1617.983643 | 0.867 |
| 1616.055176 | 0.869 |
| 1614.126709 | 0.872 |
| 1612.198242 | 0.875 |
| 1610.269775 | 0.878 |
| 1608.341309 | 0.882 |
| 1606.412842 | 0.886 |
| 1604.484375 | 0.89 |
| 1602.555908 | 0.894 |
| 1600.627441 | 0.898 |
| 1598.698975 | 0.902 |
| 1596.770508 | 0.905 |
| 1594.842041 | 0.909 |
| 1592.913574 | 0.912 |
| 1590.985107 | 0.914 |
| 1589.056641 | 0.916 |
| 1587.128174 | 0.918 |
| 1585.199707 | 0.919 |
| 1583.27124 | 0.92 |
| 1581.342773 | 0.921 |
| 1579.414307 | 0.922 |
| 1577.48584 | 0.922 |
| 1575.557373 | 0.922 |
| 1573.628906 | 0.922 |
| 1571.700439 | 0.921 |
| 1569.771973 | 0.921 |
| 1567.843506 | 0.92 |
| 1565.915039 | 0.92 |
| 1563.986572 | 0.92 |
| 1562.058105 | 0.92 |
| 1560.129639 | 0.92 |
| 1558.201172 | 0.92 |
| 1556.272705 | 0.92 |
| 1554.344238 | 0.921 |
| 1552.415771 | 0.921 |
| 1550.487305 | 0.922 |
| 1548.558838 | 0.923 |
| 1546.630371 | 0.924 |
| 1544.701904 | 0.925 |
| 1542.773438 | 0.927 |
| 1540.844971 | 0.928 |
| 1538.916504 | 0.93 |
| 1536.988037 | 0.931 |
| 1535.05957 | 0.932 |
| 1533.131104 | 0.933 |
| 1531.202637 | 0.934 |
| 1529.27417 | 0.935 |
| 1527.345703 | 0.937 |
| 1525.417236 | 0.937 |
| 1523.48877 | 0.938 |
| 1521.560303 | 0.939 |
| 1519.631836 | 0.939 |
| 1517.703369 | 0.94 |
| 1515.774902 | 0.941 |
| 1513.846436 | 0.942 |
| 1511.917969 | 0.943 |
| 1509.989502 | 0.944 |
| 1508.061035 | 0.946 |
| 1506.132568 | 0.948 |
| 1504.204102 | 0.95 |
| 1502.275635 | 0.952 |
| 1500.347168 | 0.954 |
| 1498.418701 | 0.956 |
| 1496.490234 | 0.958 |
| 1494.561768 | 0.96 |
| 1492.633301 | 0.962 |
| 1490.704834 | 0.963 |
| 1488.776367 | 0.964 |
| 1486.8479 | 0.964 |
| 1484.919434 | 0.964 |
| 1482.990967 | 0.963 |
| 1481.0625 | 0.962 |
| 1479.134033 | 0.96 |
| 1477.205566 | 0.958 |
| 1475.2771 | 0.956 |
| 1473.348633 | 0.954 |
| 1471.420166 | 0.952 |
| 1469.491699 | 0.95 |
| 1467.563232 | 0.947 |
| 1465.634766 | 0.945 |
| 1463.706299 | 0.944 |
| 1461.777832 | 0.942 |
| 1459.849365 | 0.941 |
| 1457.920898 | 0.94 |
| 1455.992432 | 0.94 |
| 1454.063965 | 0.939 |
| 1452.135498 | 0.939 |
| 1450.207031 | 0.938 |
| 1448.278564 | 0.938 |
| 1446.350098 | 0.937 |
| 1444.421631 | 0.936 |
| 1442.493164 | 0.935 |
| 1440.564697 | 0.934 |
| 1438.63623 | 0.933 |
| 1436.707764 | 0.931 |
| 1434.779297 | 0.929 |
| 1432.85083 | 0.927 |
| 1430.922363 | 0.924 |
| 1428.993896 | 0.922 |
| 1427.06543 | 0.92 |
| 1425.136963 | 0.919 |
| 1423.208496 | 0.917 |
| 1421.280029 | 0.916 |
| 1419.351563 | 0.915 |
| 1417.423096 | 0.914 |
| 1415.494629 | 0.913 |
| 1413.566162 | 0.913 |
| 1411.637695 | 0.912 |
| 1409.709229 | 0.912 |
| 1407.780762 | 0.911 |
| 1405.852295 | 0.91 |
| 1403.923828 | 0.91 |
| 1401.995361 | 0.909 |
| 1400.066895 | 0.908 |
| 1398.138428 | 0.907 |
| 1396.209961 | 0.906 |
| 1394.281494 | 0.905 |
| 1392.353027 | 0.905 |
| 1390.424561 | 0.904 |
| 1388.496094 | 0.904 |
| 1386.567627 | 0.903 |
| 1384.63916 | 0.904 |
| 1382.710693 | 0.904 |
| 1380.782227 | 0.905 |
| 1378.85376 | 0.905 |
| 1376.925293 | 0.906 |
| 1374.996826 | 0.907 |
| 1373.068359 | 0.908 |
| 1371.139893 | 0.909 |
| 1369.211426 | 0.911 |
| 1367.282959 | 0.912 |
| 1365.354492 | 0.913 |
| 1363.426025 | 0.914 |
| 1361.497559 | 0.914 |
| 1359.569092 | 0.915 |
| 1357.640625 | 0.915 |
| 1355.712158 | 0.916 |
| 1353.783691 | 0.916 |
| 1351.855225 | 0.916 |
| 1349.926758 | 0.916 |
| 1347.998291 | 0.916 |
| 1346.069824 | 0.916 |
| 1344.141357 | 0.916 |
| 1342.212891 | 0.917 |
| 1340.284424 | 0.917 |
| 1338.355957 | 0.917 |
| 1336.42749 | 0.917 |
| 1334.499023 | 0.918 |
| 1332.570557 | 0.918 |
| 1330.64209 | 0.918 |
| 1328.713623 | 0.919 |
| 1326.785156 | 0.919 |
| 1324.856689 | 0.92 |
| 1322.928223 | 0.92 |
| 1320.999756 | 0.92 |
| 1319.071289 | 0.92 |
| 1317.142822 | 0.92 |
| 1315.214355 | 0.92 |
| 1313.285889 | 0.92 |
| 1311.357422 | 0.92 |
| 1309.428955 | 0.92 |
| 1307.500488 | 0.92 |
| 1305.572021 | 0.92 |
| 1303.643555 | 0.919 |
| 1301.715088 | 0.919 |
| 1299.786621 | 0.919 |
| 1297.858154 | 0.919 |
| 1295.929688 | 0.919 |
| 1294.001221 | 0.919 |
| 1292.072754 | 0.919 |
| 1290.144287 | 0.919 |
| 1288.21582 | 0.919 |
| 1286.287354 | 0.919 |
| 1284.358887 | 0.918 |
| 1282.43042 | 0.918 |
| 1280.501953 | 0.918 |
| 1278.573486 | 0.917 |
| 1276.64502 | 0.917 |
| 1274.716553 | 0.916 |
| 1272.788086 | 0.916 |
| 1270.859619 | 0.915 |
| 1268.931152 | 0.915 |
| 1267.002686 | 0.915 |
| 1265.074219 | 0.914 |
| 1263.145752 | 0.914 |
| 1261.217285 | 0.914 |
| 1259.288818 | 0.913 |
| 1257.360352 | 0.913 |
| 1255.431885 | 0.912 |
| 1253.503418 | 0.912 |
| 1251.574951 | 0.911 |
| 1249.646484 | 0.91 |
| 1247.718018 | 0.909 |
| 1245.789551 | 0.907 |
| 1243.861084 | 0.906 |
| 1241.932617 | 0.904 |
| 1240.00415 | 0.902 |
| 1238.075684 | 0.9 |
| 1236.147217 | 0.898 |
| 1234.21875 | 0.896 |
| 1232.290283 | 0.894 |
| 1230.361816 | 0.893 |
| 1228.43335 | 0.891 |
| 1226.504883 | 0.89 |
| 1224.576416 | 0.889 |
| 1222.647949 | 0.889 |
| 1220.719482 | 0.888 |
| 1218.791016 | 0.888 |
| 1216.862549 | 0.888 |
| 1214.934082 | 0.889 |
| 1213.005615 | 0.889 |
| 1211.077148 | 0.89 |
| 1209.148682 | 0.891 |
| 1207.220215 | 0.892 |
| 1205.291748 | 0.892 |
| 1203.363281 | 0.893 |
| 1201.434814 | 0.893 |
| 1199.506348 | 0.893 |
| 1197.577881 | 0.893 |
| 1195.649414 | 0.893 |
| 1193.720947 | 0.893 |
| 1191.79248 | 0.893 |
| 1189.864014 | 0.893 |
| 1187.935547 | 0.892 |
| 1186.00708 | 0.892 |
| 1184.078613 | 0.892 |
| 1182.150146 | 0.891 |
| 1180.22168 | 0.891 |
| 1178.293213 | 0.891 |
| 1176.364746 | 0.891 |
| 1174.436279 | 0.891 |
| 1172.507813 | 0.892 |
| 1170.579346 | 0.892 |
| 1168.650879 | 0.892 |
| 1166.722412 | 0.893 |
| 1164.793945 | 0.893 |
| 1162.865479 | 0.893 |
| 1160.937012 | 0.893 |
| 1159.008545 | 0.893 |
| 1157.080078 | 0.893 |
| 1155.151611 | 0.893 |
| 1153.223145 | 0.893 |
| 1151.294678 | 0.892 |
| 1149.366211 | 0.892 |
| 1147.437744 | 0.891 |
| 1145.509277 | 0.891 |
| 1143.580811 | 0.89 |
| 1141.652344 | 0.889 |
| 1139.723877 | 0.889 |
| 1137.79541 | 0.888 |
| 1135.866943 | 0.888 |
| 1133.938477 | 0.888 |
| 1132.01001 | 0.888 |
| 1130.081543 | 0.888 |
| 1128.153076 | 0.888 |
| 1126.224609 | 0.888 |
| 1124.296143 | 0.889 |
| 1122.367676 | 0.889 |
| 1120.439209 | 0.889 |
| 1118.510742 | 0.889 |
| 1116.582275 | 0.889 |
| 1114.653809 | 0.889 |
| 1112.725342 | 0.888 |
| 1110.796875 | 0.888 |
| 1108.868408 | 0.887 |
| 1106.939941 | 0.887 |
| 1105.011475 | 0.886 |
| 1103.083008 | 0.885 |
| 1101.154541 | 0.884 |
| 1099.226074 | 0.883 |
| 1097.297607 | 0.882 |
| 1095.369141 | 0.881 |
| 1093.440674 | 0.88 |
| 1091.512207 | 0.879 |
| 1089.58374 | 0.879 |
| 1087.655273 | 0.878 |
| 1085.726807 | 0.877 |
| 1083.79834 | 0.877 |
| 1081.869873 | 0.876 |
| 1079.941406 | 0.875 |
| 1078.012939 | 0.874 |
| 1076.084473 | 0.874 |
| 1074.156006 | 0.873 |
| 1072.227539 | 0.872 |
| 1070.299072 | 0.871 |
| 1068.370605 | 0.869 |
| 1066.442139 | 0.868 |
| 1064.513672 | 0.867 |
| 1062.585205 | 0.866 |
| 1060.656738 | 0.864 |
| 1058.728271 | 0.864 |
| 1056.799805 | 0.863 |
| 1054.871338 | 0.862 |
| 1052.942871 | 0.862 |
| 1051.014404 | 0.862 |
| 1049.085938 | 0.862 |
| 1047.157471 | 0.863 |
| 1045.229004 | 0.864 |
| 1043.300537 | 0.865 |
| 1041.37207 | 0.866 |
| 1039.443604 | 0.868 |
| 1037.515137 | 0.87 |
| 1035.58667 | 0.872 |
| 1033.658203 | 0.873 |
| 1031.729736 | 0.875 |
| 1029.80127 | 0.877 |
| 1027.872803 | 0.879 |
| 1025.944336 | 0.881 |
| 1024.015869 | 0.882 |
| 1022.087402 | 0.884 |
| 1020.158936 | 0.886 |
| 1018.230469 | 0.887 |
| 1016.302002 | 0.888 |
| 1014.373535 | 0.889 |
| 1012.445068 | 0.89 |
| 1010.516602 | 0.891 |
| 1008.588135 | 0.892 |
| 1006.659668 | 0.893 |
| 1004.731201 | 0.894 |
| 1002.802734 | 0.895 |
| 1000.874268 | 0.895 |
| 998.945801 | 0.896 |
| 997.017334 | 0.896 |
| 995.088867 | 0.896 |
| 993.1604 | 0.897 |
| 991.231934 | 0.897 |
| 989.303467 | 0.897 |
| 987.375 | 0.898 |
| 985.446533 | 0.898 |
| 983.518066 | 0.899 |
| 981.5896 | 0.899 |
| 979.661133 | 0.9 |
| 977.732666 | 0.9 |
| 975.804199 | 0.901 |
| 973.875732 | 0.902 |
| 971.947266 | 0.903 |
| 970.018799 | 0.904 |
| 968.090332 | 0.905 |
| 966.161865 | 0.906 |
| 964.233398 | 0.907 |
| 962.304932 | 0.908 |
| 960.376465 | 0.909 |
| 958.447998 | 0.91 |
| 956.519531 | 0.911 |
| 954.591064 | 0.913 |
| 952.662598 | 0.914 |
| 950.734131 | 0.915 |
| 948.805664 | 0.916 |
| 946.877197 | 0.917 |
| 944.94873 | 0.918 |
| 943.020264 | 0.92 |
| 941.091797 | 0.921 |
| 939.16333 | 0.922 |
| 937.234863 | 0.924 |
| 935.306396 | 0.925 |
| 933.37793 | 0.927 |
| 931.449463 | 0.928 |
| 929.520996 | 0.929 |
| 927.592529 | 0.931 |
| 925.664063 | 0.932 |
| 923.735596 | 0.933 |
| 921.807129 | 0.934 |
| 919.878662 | 0.935 |
| 917.950195 | 0.935 |
| 916.021729 | 0.936 |
| 914.093262 | 0.936 |
| 912.164795 | 0.936 |
| 910.236328 | 0.936 |
| 908.307861 | 0.936 |
| 906.379395 | 0.936 |
| 904.450928 | 0.936 |
| 902.522461 | 0.936 |
| 900.593994 | 0.936 |
| 898.665527 | 0.935 |
| 896.737061 | 0.935 |
| 894.808594 | 0.935 |
| 892.880127 | 0.935 |
| 890.95166 | 0.935 |
| 889.023193 | 0.934 |
| 887.094727 | 0.934 |
| 885.16626 | 0.934 |
| 883.237793 | 0.933 |
| 881.309326 | 0.933 |
| 879.380859 | 0.932 |
| 877.452393 | 0.931 |
| 875.523926 | 0.93 |
| 873.595459 | 0.929 |
| 871.666992 | 0.928 |
| 869.738525 | 0.927 |
| 867.810059 | 0.926 |
| 865.881592 | 0.925 |
| 863.953125 | 0.925 |
| 862.024658 | 0.924 |
| 860.096191 | 0.924 |
| 858.167725 | 0.924 |
| 856.239258 | 0.923 |
| 854.310791 | 0.924 |
| 852.382324 | 0.924 |
| 850.453857 | 0.924 |
| 848.525391 | 0.924 |
| 846.596924 | 0.925 |
| 844.668457 | 0.925 |
| 842.73999 | 0.925 |
| 840.811523 | 0.925 |
| 838.883057 | 0.925 |
| 836.95459 | 0.924 |
| 835.026123 | 0.924 |
| 833.097656 | 0.923 |
| 831.169189 | 0.923 |
| 829.240723 | 0.922 |
| 827.312256 | 0.921 |
| 825.383789 | 0.921 |
| 823.455322 | 0.92 |
| 821.526855 | 0.92 |
| 819.598389 | 0.92 |
| 817.669922 | 0.92 |
| 815.741455 | 0.92 |
| 813.812988 | 0.921 |
| 811.884521 | 0.922 |
| 809.956055 | 0.922 |
| 808.027588 | 0.923 |
| 806.099121 | 0.924 |
| 804.170654 | 0.925 |
| 802.242188 | 0.925 |
| 800.313721 | 0.925 |
| 798.385254 | 0.925 |
| 796.456787 | 0.925 |
| 794.52832 | 0.925 |
| 792.599854 | 0.924 |
| 790.671387 | 0.923 |
| 788.74292 | 0.922 |
| 786.814453 | 0.921 |
| 784.885986 | 0.92 |
| 782.95752 | 0.919 |
| 781.029053 | 0.918 |
| 779.100586 | 0.917 |
| 777.172119 | 0.916 |
| 775.243652 | 0.916 |
| 773.315186 | 0.916 |
| 771.386719 | 0.916 |
| 769.458252 | 0.916 |
| 767.529785 | 0.916 |
| 765.601318 | 0.917 |
| 763.672852 | 0.917 |
| 761.744385 | 0.917 |
| 759.815918 | 0.917 |
| 757.887451 | 0.916 |
| 755.958984 | 0.916 |
| 754.030518 | 0.915 |
| 752.102051 | 0.914 |
| 750.173584 | 0.912 |
| 748.245117 | 0.911 |
| 746.31665 | 0.909 |
| 744.388184 | 0.907 |
| 742.459717 | 0.906 |
| 740.53125 | 0.904 |
| 738.602783 | 0.903 |
| 736.674316 | 0.902 |
| 734.74585 | 0.901 |
| 732.817383 | 0.901 |
| 730.888916 | 0.9 |
| 728.960449 | 0.9 |
| 727.031982 | 0.9 |
| 725.103516 | 0.901 |
| 723.175049 | 0.901 |
| 721.246582 | 0.901 |
| 719.318115 | 0.901 |
| 717.389648 | 0.901 |
| 715.461182 | 0.9 |
| 713.532715 | 0.899 |
| 711.604248 | 0.898 |
| 709.675781 | 0.896 |
| 707.747314 | 0.894 |
| 705.818848 | 0.892 |
| 703.890381 | 0.89 |
| 701.961914 | 0.888 |
| 700.033447 | 0.885 |
| 698.10498 | 0.883 |
| 696.176514 | 0.881 |
| 694.248047 | 0.879 |
| 692.31958 | 0.877 |
| 690.391113 | 0.875 |
| 688.462646 | 0.874 |
| 686.53418 | 0.872 |
| 684.605713 | 0.871 |
| 682.677246 | 0.87 |
| 680.748779 | 0.869 |
| 678.820313 | 0.868 |
| 676.891846 | 0.867 |
| 674.963379 | 0.867 |
| 673.034912 | 0.866 |
| 671.106445 | 0.865 |
| 669.177979 | 0.864 |
| 667.249512 | 0.863 |
| 665.321045 | 0.862 |
| 663.392578 | 0.862 |
| 661.464111 | 0.861 |
| 659.535645 | 0.861 |
| 657.607178 | 0.861 |
| 655.678711 | 0.861 |
| 653.750244 | 0.861 |
| 651.821777 | 0.862 |
| 649.893311 | 0.863 |
| 647.964844 | 0.864 |
| 646.036377 | 0.865 |
| 644.10791 | 0.867 |
| 642.179443 | 0.868 |
| 640.250977 | 0.87 |
| 638.32251 | 0.871 |
| 636.394043 | 0.872 |
| 634.465576 | 0.872 |
| 632.537109 | 0.873 |
| 630.608643 | 0.873 |
| 628.680176 | 0.872 |
| 626.751709 | 0.871 |
| 624.823242 | 0.87 |
| 622.894775 | 0.869 |
| 620.966309 | 0.867 |
| 619.037842 | 0.866 |
| 617.109375 | 0.864 |
| 615.180908 | 0.862 |
| 613.252441 | 0.861 |
| 611.323975 | 0.859 |
| 609.395508 | 0.858 |
| 607.467041 | 0.857 |
| 605.538574 | 0.857 |
| 603.610107 | 0.856 |
| 601.681641 | 0.856 |
| 599.753174 | 0.856 |
| 597.824707 | 0.856 |
| 595.89624 | 0.856 |
| 593.967773 | 0.856 |
| 592.039307 | 0.856 |
| 590.11084 | 0.855 |
| 588.182373 | 0.855 |
| 586.253906 | 0.855 |
| 584.325439 | 0.855 |
| 582.396973 | 0.854 |
| 580.468506 | 0.854 |
| 578.540039 | 0.854 |
| 576.611572 | 0.853 |
| 574.683105 | 0.853 |
| 572.754639 | 0.853 |
| 570.826172 | 0.854 |
| 568.897705 | 0.854 |
| 566.969238 | 0.855 |
| 565.040771 | 0.856 |
| 563.112305 | 0.857 |
| 561.183838 | 0.858 |
| 559.255371 | 0.858 |
| 557.326904 | 0.859 |
| 555.398438 | 0.86 |
| 553.469971 | 0.861 |
| 551.541504 | 0.861 |
| 549.613037 | 0.862 |
| 547.68457 | 0.862 |
| 545.756104 | 0.862 |
| 543.827637 | 0.861 |
| 541.89917 | 0.861 |
| 539.970703 | 0.86 |
| 538.042236 | 0.86 |
| 536.11377 | 0.859 |
| 534.185303 | 0.859 |
| 532.256836 | 0.858 |
| 530.328369 | 0.858 |
| 528.399902 | 0.858 |
| 526.471436 | 0.858 |
| 524.542969 | 0.858 |
| 522.614502 | 0.859 |
| 520.686035 | 0.859 |
| 518.757568 | 0.86 |
| 516.829102 | 0.86 |
| 514.900635 | 0.861 |
| 512.972168 | 0.861 |
| 511.043701 | 0.862 |
| 509.115234 | 0.862 |
| 507.186768 | 0.862 |
| 505.258301 | 0.863 |
| 503.329834 | 0.863 |
| 501.401367 | 0.863 |
| 499.4729 | 0.863 |
| 497.544434 | 0.863 |
| 495.615967 | 0.863 |
| 493.6875 | 0.863 |
| 491.759033 | 0.863 |
| 489.830566 | 0.864 |
| 487.9021 | 0.864 |
| 485.973633 | 0.865 |
| 484.045166 | 0.865 |
| 482.116699 | 0.866 |
| 480.188232 | 0.867 |
| 478.259766 | 0.867 |
| 476.331299 | 0.868 |
| 474.402832 | 0.869 |
| 472.474365 | 0.869 |
| 470.545898 | 0.87 |
| 468.617432 | 0.87 |
| 466.688965 | 0.87 |
| 464.760498 | 0.871 |
| 462.832031 | 0.871 |
| 460.903564 | 0.871 |
| 458.975098 | 0.871 |
| 457.046631 | 0.872 |
| 455.118164 | 0.872 |
| 453.189697 | 0.873 |
| 451.26123 | 0.873 |
| 449.332764 | 0.874 |
| 447.404297 | 0.875 |
| 445.47583 | 0.877 |
| 443.547363 | 0.878 |
| 441.618896 | 0.88 |
| 439.69043 | 0.882 |
| 437.761963 | 0.884 |
| 435.833496 | 0.886 |
| 433.905029 | 0.889 |
| 431.976563 | 0.891 |
| 430.048096 | 0.893 |
| 428.119629 | 0.895 |
| 426.191162 | 0.897 |
| 424.262695 | 0.898 |
| 422.334229 | 0.9 |
| 420.405762 | 0.901 |
| 418.477295 | 0.902 |
| 416.548828 | 0.902 |
| 414.620361 | 0.902 |
| 412.691895 | 0.901 |
| 410.763428 | 0.901 |
| 408.834961 | 0.901 |
| 406.906494 | 0.901 |
| 404.978027 | 0.901 |
| 403.049561 | 0.901 |
| 401.121094 | 0.901 |
| 399.192627 | 0.901 |